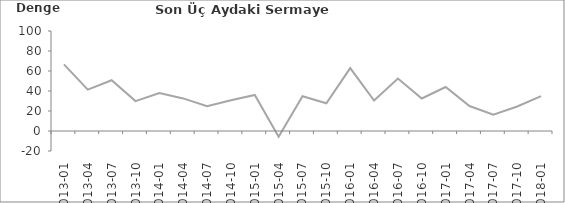
| Category | Son Üç Aydaki Sermaye Harcaması |
|---|---|
| 2013-01 | 66.6 |
| 2013-04 | 41.4 |
| 2013-07 | 50.8 |
| 2013-10 | 29.9 |
| 2014-01 | 38 |
| 2014-04 | 32.6 |
| 2014-07 | 24.8 |
| 2014-10 | 30.8 |
| 2015-01 | 36.1 |
| 2015-04 | -5.7 |
| 2015-07 | 34.7 |
| 2015-10 | 27.7 |
| 2016-01 | 62.9 |
| 2016-04 | 30.4 |
| 2016-07 | 52.5 |
| 2016-10 | 32.5 |
| 2017-01 | 44 |
| 2017-04 | 25 |
| 2017-07 | 16.3 |
| 2017-10 | 24.5 |
| 2018-01 | 34.8 |